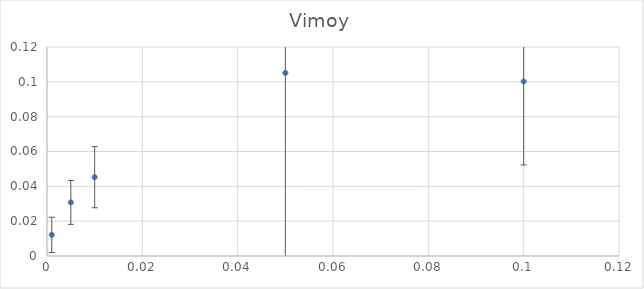
| Category | Vimoy |
|---|---|
| 0.001 | 0.012 |
| 0.005 | 0.031 |
| 0.01 | 0.045 |
| 0.05 | 0.105 |
| 0.1 | 0.1 |